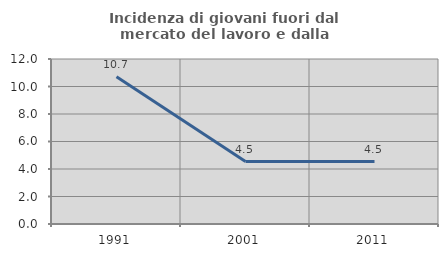
| Category | Incidenza di giovani fuori dal mercato del lavoro e dalla formazione  |
|---|---|
| 1991.0 | 10.714 |
| 2001.0 | 4.545 |
| 2011.0 | 4.545 |